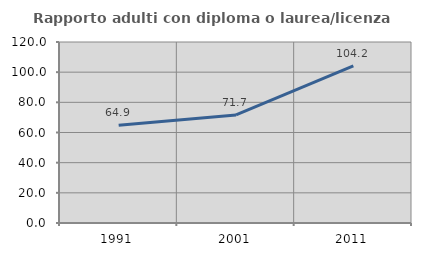
| Category | Rapporto adulti con diploma o laurea/licenza media  |
|---|---|
| 1991.0 | 64.865 |
| 2001.0 | 71.667 |
| 2011.0 | 104.225 |